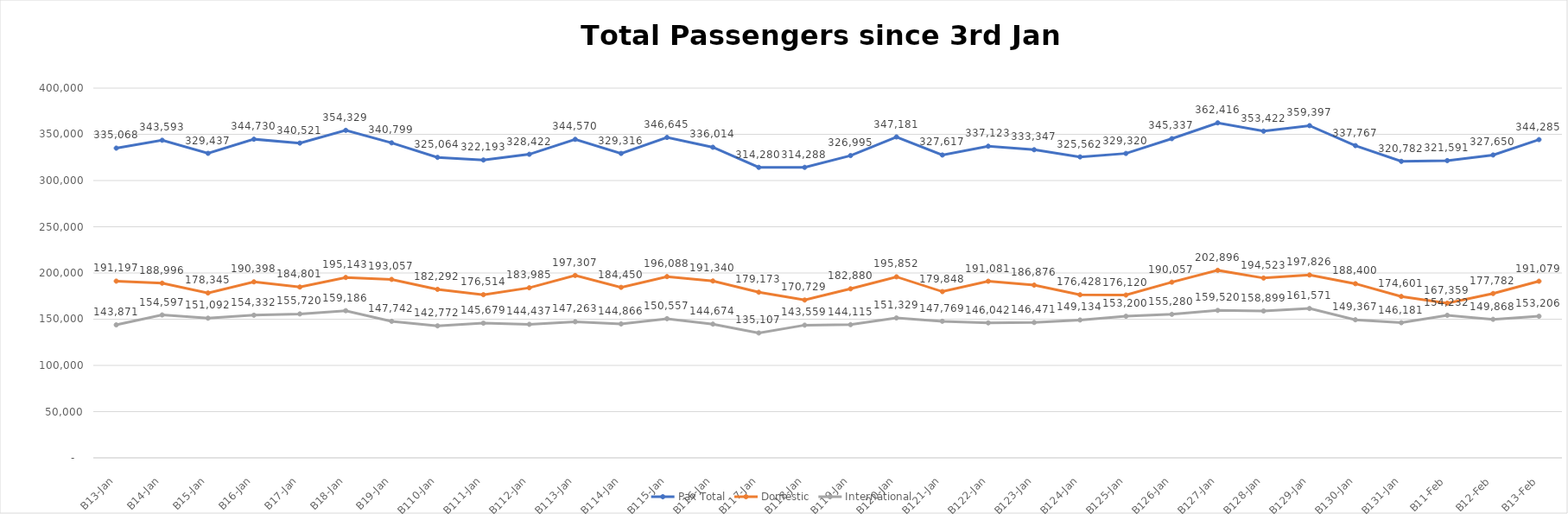
| Category | Pax Total |  Domestic  |  International  |
|---|---|---|---|
| 2023-01-03 | 335068 | 191197 | 143871 |
| 2023-01-04 | 343593 | 188996 | 154597 |
| 2023-01-05 | 329437 | 178345 | 151092 |
| 2023-01-06 | 344730 | 190398 | 154332 |
| 2023-01-07 | 340521 | 184801 | 155720 |
| 2023-01-08 | 354329 | 195143 | 159186 |
| 2023-01-09 | 340799 | 193057 | 147742 |
| 2023-01-10 | 325064 | 182292 | 142772 |
| 2023-01-11 | 322193 | 176514 | 145679 |
| 2023-01-12 | 328422 | 183985 | 144437 |
| 2023-01-13 | 344570 | 197307 | 147263 |
| 2023-01-14 | 329316 | 184450 | 144866 |
| 2023-01-15 | 346645 | 196088 | 150557 |
| 2023-01-16 | 336014 | 191340 | 144674 |
| 2023-01-17 | 314280 | 179173 | 135107 |
| 2023-01-18 | 314288 | 170729 | 143559 |
| 2023-01-19 | 326995 | 182880 | 144115 |
| 2023-01-20 | 347181 | 195852 | 151329 |
| 2023-01-21 | 327617 | 179848 | 147769 |
| 2023-01-22 | 337123 | 191081 | 146042 |
| 2023-01-23 | 333347 | 186876 | 146471 |
| 2023-01-24 | 325562 | 176428 | 149134 |
| 2023-01-25 | 329320 | 176120 | 153200 |
| 2023-01-26 | 345337 | 190057 | 155280 |
| 2023-01-27 | 362416 | 202896 | 159520 |
| 2023-01-28 | 353422 | 194523 | 158899 |
| 2023-01-29 | 359397 | 197826 | 161571 |
| 2023-01-30 | 337767 | 188400 | 149367 |
| 2023-01-31 | 320782 | 174601 | 146181 |
| 2023-02-01 | 321591 | 167359 | 154232 |
| 2023-02-02 | 327650 | 177782 | 149868 |
| 2023-02-03 | 344285 | 191079 | 153206 |